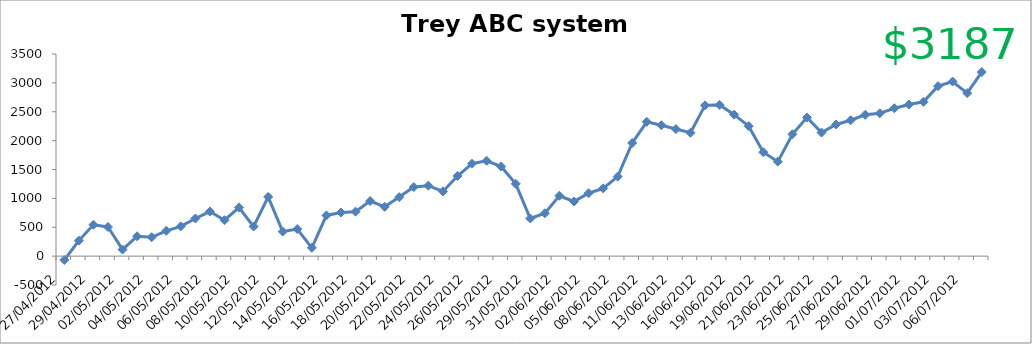
| Category | Total |
|---|---|
| 27/04/2012 | -66.965 |
| 28/04/2012 | 268.715 |
| 29/04/2012 | 542.795 |
| 01/05/2012 | 504.43 |
| 02/05/2012 | 114.05 |
| 03/05/2012 | 343.13 |
| 04/05/2012 | 326.54 |
| 05/05/2012 | 438.38 |
| 06/05/2012 | 515.28 |
| 07/05/2012 | 651.465 |
| 08/05/2012 | 772.105 |
| 09/05/2012 | 622.105 |
| 10/05/2012 | 841.505 |
| 11/05/2012 | 512.175 |
| 12/05/2012 | 1025.535 |
| 13/05/2012 | 425.535 |
| 14/05/2012 | 468.635 |
| 15/05/2012 | 144.155 |
| 16/05/2012 | 704.795 |
| 17/05/2012 | 754.795 |
| 18/05/2012 | 769.385 |
| 19/05/2012 | 953.585 |
| 20/05/2012 | 853.585 |
| 21/05/2012 | 1021.795 |
| 22/05/2012 | 1196.275 |
| 23/05/2012 | 1220.275 |
| 24/05/2012 | 1120.275 |
| 25/05/2012 | 1387.575 |
| 26/05/2012 | 1601.175 |
| 28/05/2012 | 1651.675 |
| 29/05/2012 | 1551.675 |
| 30/05/2012 | 1251.675 |
| 31/05/2012 | 651.675 |
| 01/06/2012 | 742.675 |
| 02/06/2012 | 1045.675 |
| 04/06/2012 | 945.675 |
| 05/06/2012 | 1089.275 |
| 06/06/2012 | 1173.835 |
| 08/06/2012 | 1376.835 |
| 09/06/2012 | 1959.315 |
| 11/06/2012 | 2325.315 |
| 12/06/2012 | 2266.535 |
| 13/06/2012 | 2199.995 |
| 15/06/2012 | 2136.045 |
| 16/06/2012 | 2610.645 |
| 18/06/2012 | 2618.815 |
| 19/06/2012 | 2450.015 |
| 20/06/2012 | 2250.015 |
| 21/06/2012 | 1800.015 |
| 22/06/2012 | 1636.015 |
| 23/06/2012 | 2109.955 |
| 24/06/2012 | 2400.355 |
| 25/06/2012 | 2139.885 |
| 26/06/2012 | 2279.565 |
| 27/06/2012 | 2352.965 |
| 28/06/2012 | 2447.19 |
| 29/06/2012 | 2472.685 |
| 30/06/2012 | 2560.285 |
| 01/07/2012 | 2624.725 |
| 02/07/2012 | 2672.465 |
| 03/07/2012 | 2942.985 |
| 04/07/2012 | 3022.685 |
| 06/07/2012 | 2822.685 |
| 07/07/2012 | 3187.245 |